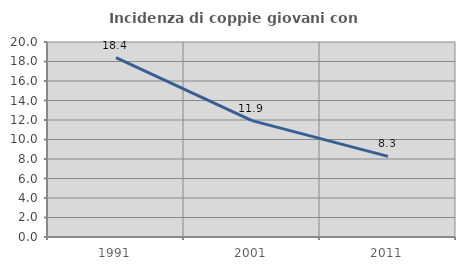
| Category | Incidenza di coppie giovani con figli |
|---|---|
| 1991.0 | 18.387 |
| 2001.0 | 11.933 |
| 2011.0 | 8.272 |